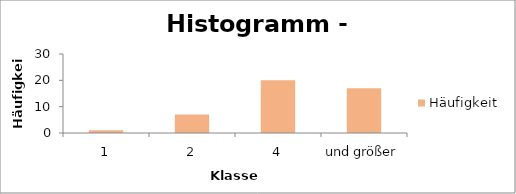
| Category | Häufigkeit |
|---|---|
| 1 | 1 |
| 2 | 7 |
| 4 | 20 |
| und größer | 17 |